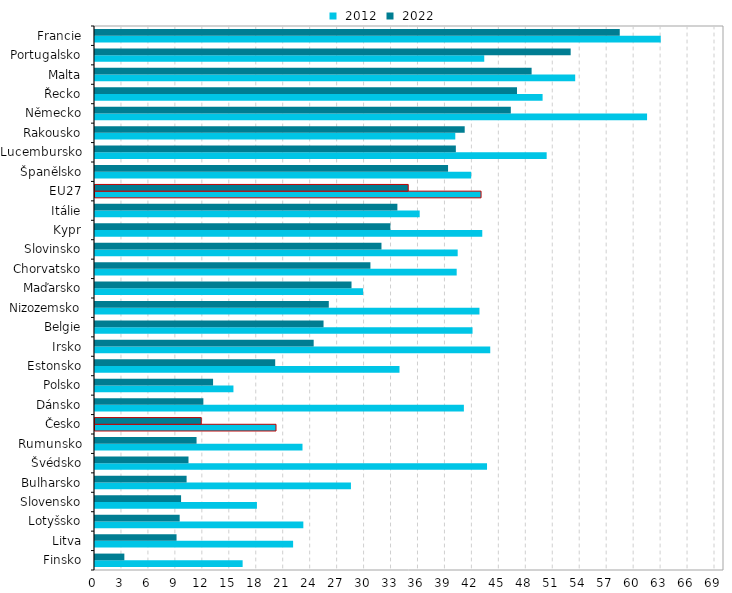
| Category |  2012 |  2022 |
|---|---|---|
| Finsko | 16.43 | 3.267 |
| Litva | 22.048 | 9.075 |
| Lotyšsko | 23.185 | 9.423 |
| Slovensko | 18.02 | 9.578 |
| Bulharsko | 28.483 | 10.196 |
| Švédsko | 43.628 | 10.406 |
| Rumunsko | 23.092 | 11.303 |
| Česko | 20.144 | 11.823 |
| Dánsko | 41.052 | 12.06 |
| Polsko | 15.407 | 13.14 |
| Estonsko | 33.887 | 20.055 |
| Irsko | 43.986 | 24.336 |
| Belgie | 42.015 | 25.434 |
| Nizozemsko | 42.787 | 26.019 |
| Maďarsko | 29.839 | 28.547 |
| Chorvatsko | 40.252 | 30.651 |
| Slovinsko | 40.363 | 31.881 |
| Kypr | 43.099 | 32.871 |
| Itálie | 36.134 | 33.652 |
| EU27 | 42.963 | 34.858 |
| Španělsko | 41.865 | 39.29 |
| Lucembursko | 50.265 | 40.158 |
| Rakousko | 40.097 | 41.144 |
| Německo | 61.438 | 46.276 |
| Řecko | 49.812 | 46.964 |
| Malta | 53.439 | 48.589 |
| Portugalsko | 43.319 | 52.937 |
| Francie | 62.96 | 58.399 |